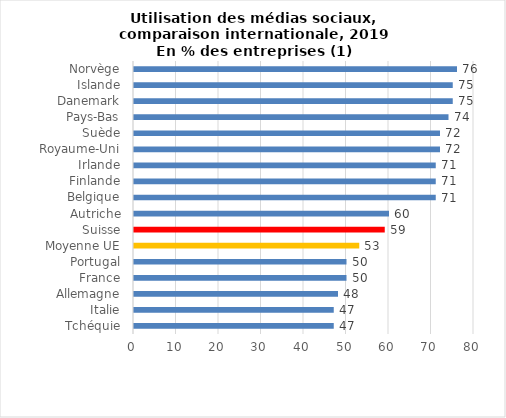
| Category | 2019 |
|---|---|
| Tchéquie | 47 |
| Italie | 47 |
| Allemagne | 48 |
| France | 50 |
| Portugal | 50 |
| Moyenne UE | 53 |
| Suisse | 59 |
| Autriche | 60 |
| Belgique | 71 |
| Finlande | 71 |
| Irlande | 71 |
| Royaume-Uni | 72 |
| Suède | 72 |
| Pays-Bas | 74 |
| Danemark | 75 |
| Islande | 75 |
| Norvège | 76 |